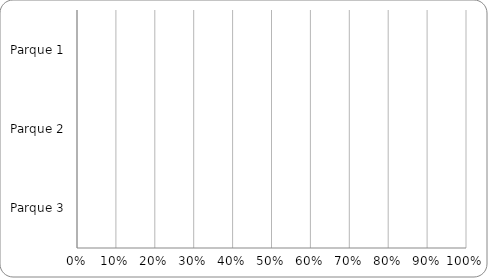
| Category | Porcentaje total de cumplimiento indicadores obligatorios | Porcentaje de cumplimiento de Indicadores obligatorios secundarios |
|---|---|---|
| Parque 1 | 0 | 0 |
| Parque 2 | 0 | 0 |
| Parque 3 | 0 | 0 |